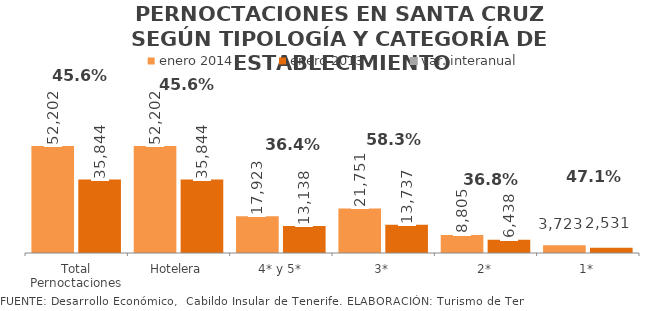
| Category | enero 2014 | enero 2013 |
|---|---|---|
| Total Pernoctaciones | 52202 | 35844 |
| Hotelera | 52202 | 35844 |
| 4* y 5* | 17923 | 13138 |
| 3* | 21751 | 13737 |
| 2* | 8805 | 6438 |
| 1* | 3723 | 2531 |